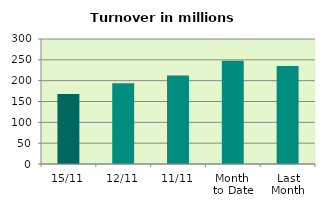
| Category | Series 0 |
|---|---|
| 15/11 | 168.054 |
| 12/11 | 194.04 |
| 11/11 | 212.621 |
| Month 
to Date | 247.607 |
| Last
Month | 235.36 |